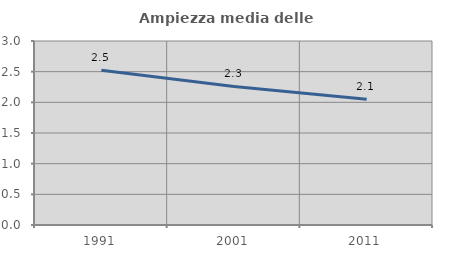
| Category | Ampiezza media delle famiglie |
|---|---|
| 1991.0 | 2.521 |
| 2001.0 | 2.258 |
| 2011.0 | 2.051 |